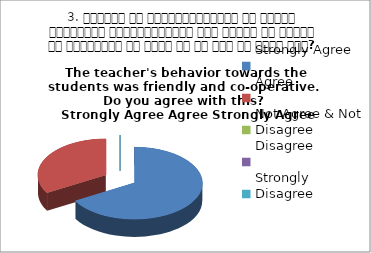
| Category | 3. शिक्षक का विद्यार्थियों के प्रति व्यव्हार मित्रतापूर्ण एवं सहयोग के भावना से परिपूर्ण था क्या आप इस बात से सहमत हैं? 
The teacher's behavior towards the students was friendly and co-operative.  Do you agree with this? 
 Strongly Agree Agree Strongly Ag |
|---|---|
| Strongly Agree | 2 |
| Agree | 1 |
| Not Agree & Not Disagree | 0 |
| Disagree | 0 |
| Strongly Disagree | 0 |